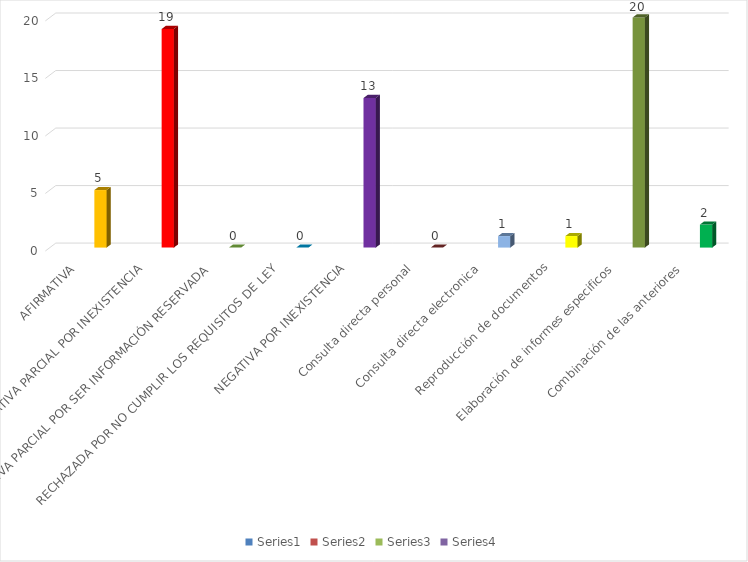
| Category | Series 0 | Series 1 | Series 2 | Series 3 |
|---|---|---|---|---|
| AFIRMATIVA |  |  |  | 5 |
| AFIRMATIVA PARCIAL POR INEXISTENCIA |  |  |  | 19 |
| AFIRMATIVA PARCIAL POR SER INFORMACIÓN RESERVADA |  |  |  | 0 |
| RECHAZADA POR NO CUMPLIR LOS REQUISITOS DE LEY |  |  |  | 0 |
| NEGATIVA POR INEXISTENCIA |  |  |  | 13 |
| Consulta directa personal |  |  |  | 0 |
| Consulta directa electronica |  |  |  | 1 |
| Reproducción de documentos |  |  |  | 1 |
| Elaboración de informes especificos |  |  |  | 20 |
| Combinación de las anteriores |  |  |  | 2 |